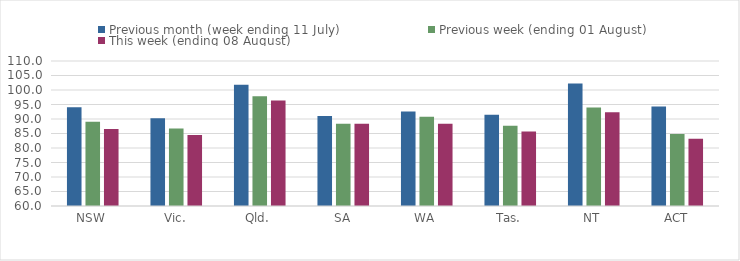
| Category | Previous month (week ending 11 July) | Previous week (ending 01 August) | This week (ending 08 August) |
|---|---|---|---|
| NSW | 94.031 | 89.022 | 86.527 |
| Vic. | 90.274 | 86.703 | 84.462 |
| Qld. | 101.811 | 97.887 | 96.366 |
| SA | 91.063 | 88.36 | 88.36 |
| WA | 92.613 | 90.757 | 88.391 |
| Tas. | 91.423 | 87.693 | 85.7 |
| NT | 102.208 | 93.929 | 92.318 |
| ACT | 94.313 | 84.834 | 83.147 |